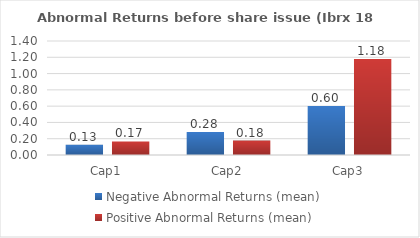
| Category | Negative Abnormal Returns (mean) | Positive Abnormal Returns (mean) |
|---|---|---|
| Cap1 | 0.126 | 0.167 |
| Cap2 | 0.282 | 0.178 |
| Cap3 | 0.602 | 1.178 |